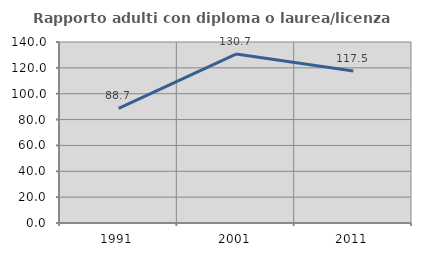
| Category | Rapporto adulti con diploma o laurea/licenza media  |
|---|---|
| 1991.0 | 88.688 |
| 2001.0 | 130.664 |
| 2011.0 | 117.53 |